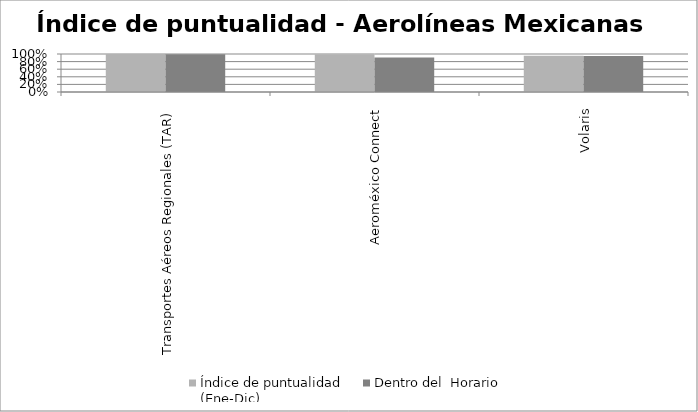
| Category | Índice de puntualidad
(Ene-Dic) | Dentro del  Horario |
|---|---|---|
| Transportes Aéreos Regionales (TAR) | 0.998 | 0.994 |
| Aeroméxico Connect | 0.996 | 0.909 |
| Volaris | 0.956 | 0.945 |